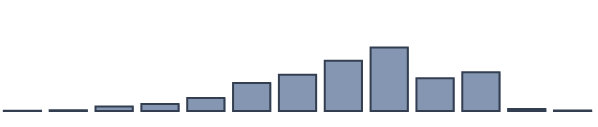
| Category | Series 0 |
|---|---|
| 0 | 0.076 |
| 1 | 0.303 |
| 2 | 1.591 |
| 3 | 2.5 |
| 4 | 4.697 |
| 5 | 10.076 |
| 6 | 13.106 |
| 7 | 18.106 |
| 8 | 22.879 |
| 9 | 11.818 |
| 10 | 13.939 |
| 11 | 0.758 |
| 12 | 0.152 |